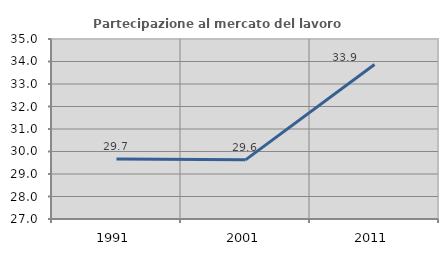
| Category | Partecipazione al mercato del lavoro  femminile |
|---|---|
| 1991.0 | 29.664 |
| 2001.0 | 29.63 |
| 2011.0 | 33.866 |